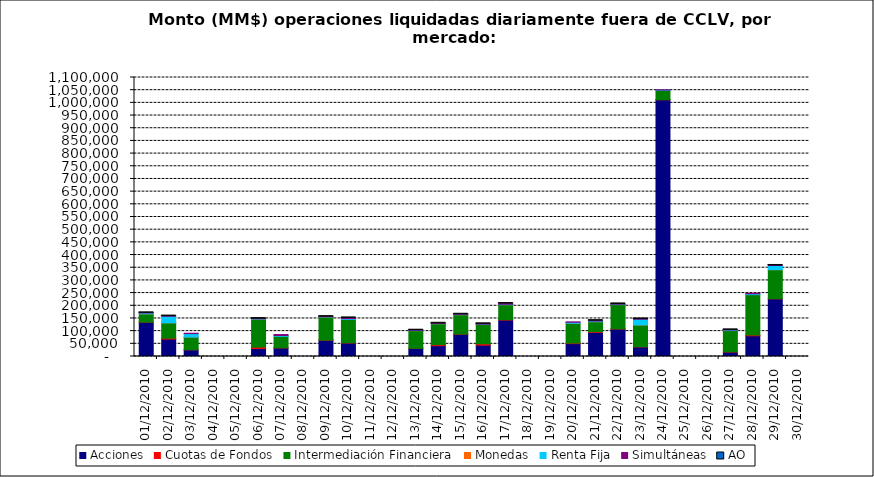
| Category | Acciones | Cuotas de Fondos | Intermediación Financiera | Monedas | Renta Fija | Simultáneas | AO |
|---|---|---|---|---|---|---|---|
| 01/12/2010 | 135016.928 | 455.638 | 32730.29 | 5.16 | 3670.499 | 138.524 | 0.082 |
| 02/12/2010 | 68620.357 | 3537.588 | 60566.202 | 9.021 | 26049.571 | 575.512 | 0.472 |
| 03/12/2010 | 26453.258 | 200.856 | 49931.923 | 1.435 | 13670.002 | 1518.559 | 0 |
| 06/12/2010 | 31326.276 | 5675.298 | 110272.878 | 1.485 | 1575.356 | 379.164 | 0.01 |
| 07/12/2010 | 33761.123 | 743.458 | 44973.938 | 0 | 3382.993 | 3758.648 | 0 |
| 09/12/2010 | 64190.088 | 678.616 | 90676.823 | 14.875 | 1093.289 | 383.054 | 0.041 |
| 10/12/2010 | 53274.426 | 866.538 | 91917.024 | 2.94 | 3208.974 | 2738.213 | 0.062 |
| 13/12/2010 | 31996.532 | 349.69 | 69637.404 | 89.493 | 1383.026 | 124.816 | 0.002 |
| 14/12/2010 | 42802.294 | 3966.824 | 82533.813 | 6.688 | 960.429 | 661.499 | 0.01 |
| 15/12/2010 | 87779.183 | 716.08 | 76387.75 | 0.415 | 1426.929 | 177.389 | 0.727 |
| 16/12/2010 | 44726.23 | 5254.575 | 77014.023 | 2.085 | 755.256 | 969.91 | 0.105 |
| 17/12/2010 | 143636.045 | 1538.696 | 59217.435 | 4.17 | 1553.39 | 2706.047 | 1.798 |
| 20/12/2010 | 50747.386 | 2061.898 | 78097.725 | 2.496 | 3964.784 | 1539.198 | 0 |
| 21/12/2010 | 94812.709 | 2782.52 | 39673.287 | 27.519 | 2712.064 | 1152.841 | 0.055 |
| 22/12/2010 | 108268.453 | 918.58 | 95546.221 | 10.425 | 1457.245 | 1016.586 | 0.338 |
| 23/12/2010 | 37744.461 | 709.015 | 85903.007 | 15.846 | 22576.05 | 794.324 | 0.385 |
| 24/12/2010 | 1012372.945 | 183.264 | 36412.062 | 0 | 1574.115 | 841.777 | 0 |
| 27/12/2010 | 17530.179 | 947.373 | 83855.704 | 11.259 | 2297.523 | 224.965 | 0.133 |
| 28/12/2010 | 81635.906 | 3083.256 | 159112.537 | 0 | 3452.308 | 2024.806 | 0 |
| 29/12/2010 | 227331.133 | 644.134 | 114362.35 | 1.678 | 16427.42 | 132.389 | 0.015 |